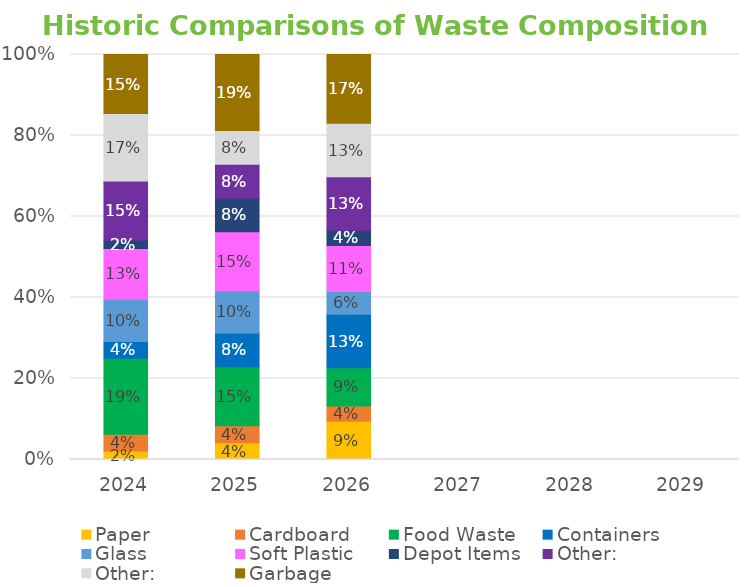
| Category | Paper | Cardboard | Food Waste | Containers | Glass | Soft Plastic | Depot Items | Other: | Other:  | Garbage |
|---|---|---|---|---|---|---|---|---|---|---|
| 2024.0 | 0.021 | 0.042 | 0.188 | 0.042 | 0.104 | 0.125 | 0.021 | 0.146 | 0.167 | 0.146 |
| 2025.0 | 0.042 | 0.042 | 0.146 | 0.083 | 0.104 | 0.146 | 0.083 | 0.083 | 0.083 | 0.188 |
| 2026.0 | 0.094 | 0.038 | 0.094 | 0.132 | 0.057 | 0.113 | 0.038 | 0.132 | 0.132 | 0.17 |
| 2027.0 | 0 | 0 | 0 | 0 | 0 | 0 | 0 | 0 | 0 | 0 |
| 2028.0 | 0 | 0 | 0 | 0 | 0 | 0 | 0 | 0 | 0 | 0 |
| 2029.0 | 0 | 0 | 0 | 0 | 0 | 0 | 0 | 0 | 0 | 0 |